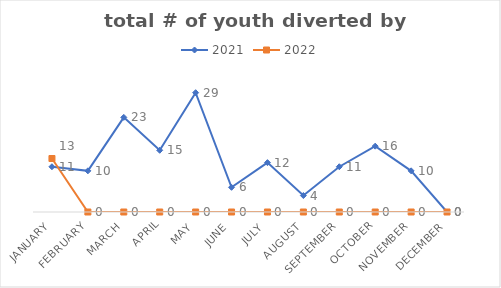
| Category | 2021 | 2022 |
|---|---|---|
| January | 11 | 13 |
| February | 10 | 0 |
| March | 23 | 0 |
| April | 15 | 0 |
| May | 29 | 0 |
| June | 6 | 0 |
| July | 12 | 0 |
| August | 4 | 0 |
| September | 11 | 0 |
| October | 16 | 0 |
| November | 10 | 0 |
| December | 0 | 0 |